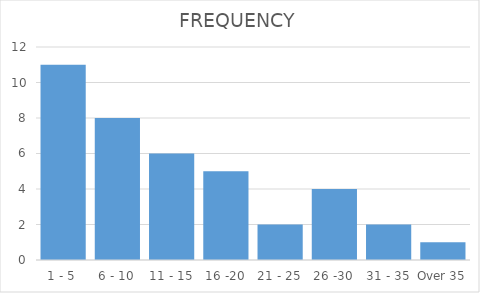
| Category | FREQUENCY |
|---|---|
| 1 - 5 | 11 |
| 6 - 10 | 8 |
| 11 - 15 | 6 |
| 16 -20 | 5 |
| 21 - 25 | 2 |
| 26 -30 | 4 |
| 31 - 35 | 2 |
| Over 35 | 1 |